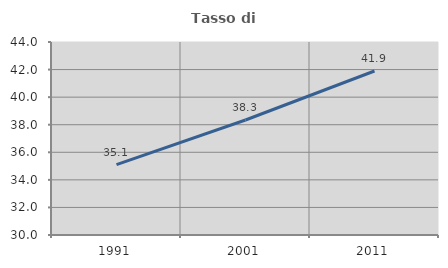
| Category | Tasso di occupazione   |
|---|---|
| 1991.0 | 35.108 |
| 2001.0 | 38.343 |
| 2011.0 | 41.898 |